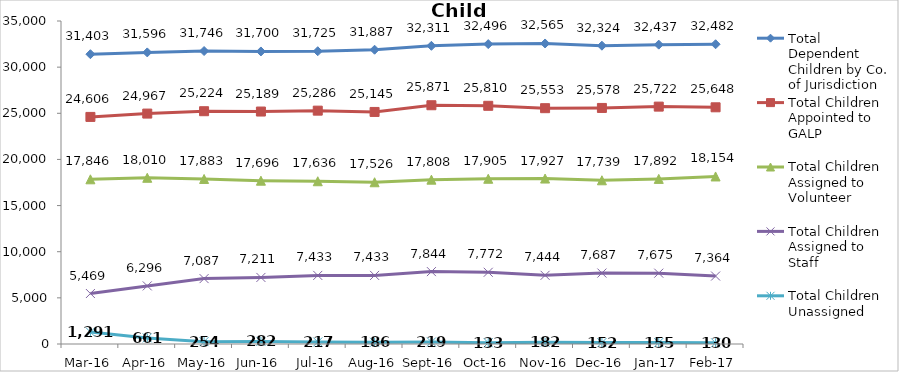
| Category | Total Dependent Children by Co. of Jurisdiction | Total Children Appointed to GALP | Total Children Assigned to Volunteer | Total Children Assigned to Staff | Total Children Unassigned |
|---|---|---|---|---|---|
| Mar-16 | 31403 | 24606 | 17846 | 5469 | 1291 |
| Apr-16 | 31596 | 24967 | 18010 | 6296 | 661 |
| May-16 | 31746 | 25224 | 17883 | 7087 | 254 |
| Jun-16 | 31700 | 25189 | 17696 | 7211 | 282 |
| Jul-16 | 31725 | 25286 | 17636 | 7433 | 217 |
| Aug-16 | 31887 | 25145 | 17526 | 7433 | 186 |
| Sep-16 | 32311 | 25871 | 17808 | 7844 | 219 |
| Oct-16 | 32496 | 25810 | 17905 | 7772 | 133 |
| Nov-16 | 32565 | 25553 | 17927 | 7444 | 182 |
| Dec-16 | 32324 | 25578 | 17739 | 7687 | 152 |
| Jan-17 | 32437 | 25722 | 17892 | 7675 | 155 |
| Feb-17 | 32482 | 25648 | 18154 | 7364 | 130 |